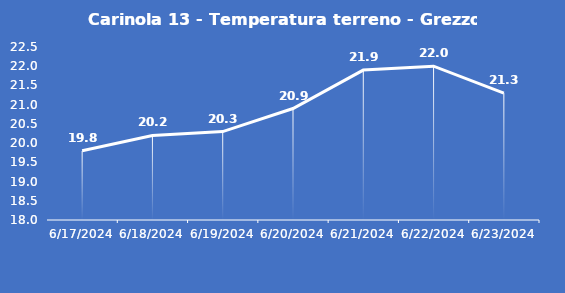
| Category | Carinola 13 - Temperatura terreno - Grezzo (°C) |
|---|---|
| 6/17/24 | 19.8 |
| 6/18/24 | 20.2 |
| 6/19/24 | 20.3 |
| 6/20/24 | 20.9 |
| 6/21/24 | 21.9 |
| 6/22/24 | 22 |
| 6/23/24 | 21.3 |